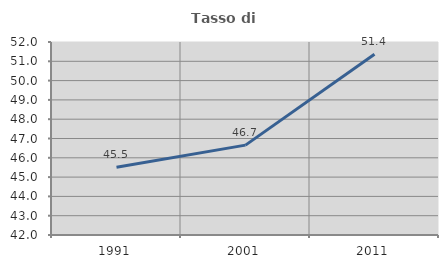
| Category | Tasso di occupazione   |
|---|---|
| 1991.0 | 45.506 |
| 2001.0 | 46.656 |
| 2011.0 | 51.369 |